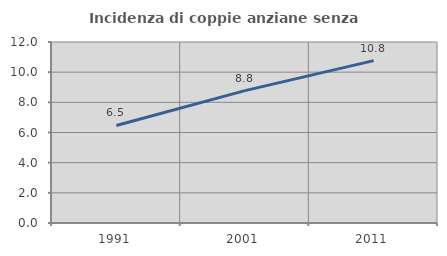
| Category | Incidenza di coppie anziane senza figli  |
|---|---|
| 1991.0 | 6.468 |
| 2001.0 | 8.774 |
| 2011.0 | 10.766 |